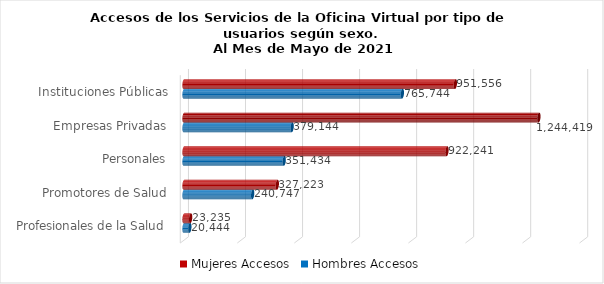
| Category | Mujeres | Hombres |
|---|---|---|
| Instituciones Públicas | 951556 | 765744 |
| Empresas Privadas | 1244419 | 379144 |
| Personales | 922241 | 351434 |
| Promotores de Salud | 327223 | 240747 |
| Profesionales de la Salud | 23235 | 20444 |